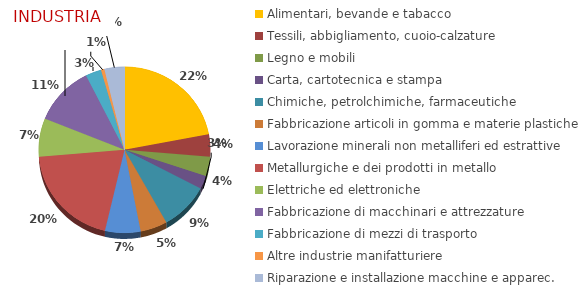
| Category | Series 0 |
|---|---|
| Alimentari, bevande e tabacco | 7222 |
| Tessili, abbigliamento, cuoio-calzature | 1424 |
| Legno e mobili | 1238 |
| Carta, cartotecnica e stampa | 855 |
| Chimiche, petrolchimiche, farmaceutiche | 3018 |
| Fabbricazione articoli in gomma e materie plastiche | 1666 |
| Lavorazione minerali non metalliferi ed estrattive | 2196 |
| Metallurgiche e dei prodotti in metallo | 6555 |
| Elettriche ed elettroniche | 2458 |
| Fabbricazione di macchinari e attrezzature | 3765 |
| Fabbricazione di mezzi di trasporto | 979 |
| Altre industrie manifatturiere | 206 |
| Riparazione e installazione macchine e apparec. | 1246 |